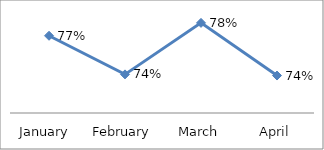
| Category | ACCURACY |
|---|---|
| January  | 0.77 |
| February | 0.74 |
| March | 0.78 |
| April | 0.739 |